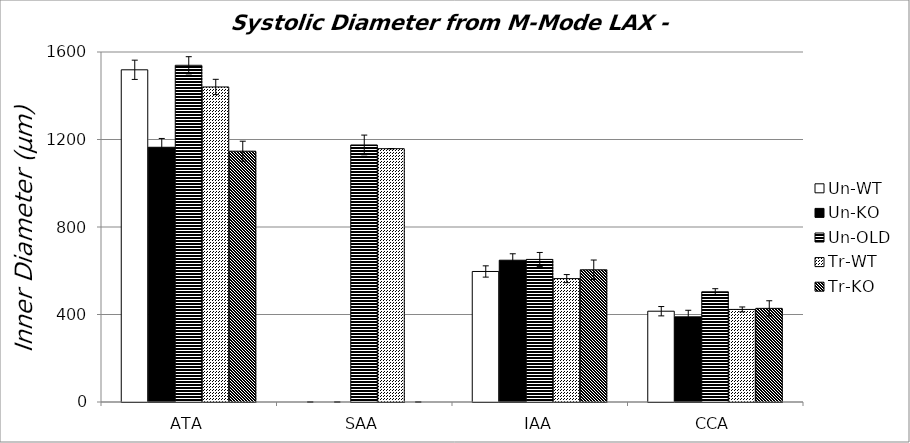
| Category | Un-WT | Un-KO | Un-OLD | Tr-WT | Tr-KO |
|---|---|---|---|---|---|
| 0 | 1518.636 | 1164.488 | 1539.216 | 1440.205 | 1146.538 |
| 1 | 0 | 0 | 1175.063 | 1158.092 | 0 |
| 2 | 596.706 | 648.211 | 651.792 | 564.044 | 604.288 |
| 3 | 415.032 | 389.173 | 503.576 | 423.196 | 428.103 |